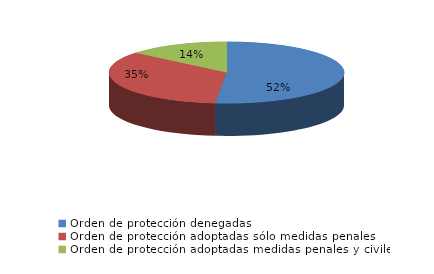
| Category | Series 0 |
|---|---|
| Orden de protección denegadas | 322 |
| Orden de protección adoptadas sólo medidas penales | 216 |
| Orden de protección adoptadas medidas penales y civiles | 87 |